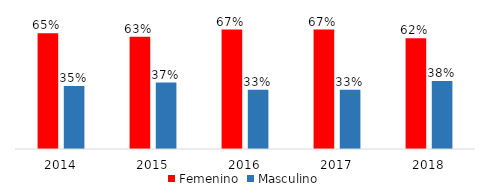
| Category | Femenino | Masculino |
|---|---|---|
| 2014.0 | 0.648 | 0.352 |
| 2015.0 | 0.628 | 0.372 |
| 2016.0 | 0.668 | 0.332 |
| 2017.0 | 0.668 | 0.332 |
| 2018.0 | 0.62 | 0.38 |